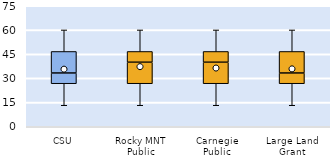
| Category | 25th | 50th | 75th |
|---|---|---|---|
| CSU | 26.667 | 6.667 | 13.333 |
| Rocky MNT Public | 26.667 | 13.333 | 6.667 |
| Carnegie Public | 26.667 | 13.333 | 6.667 |
| Large Land Grant | 26.667 | 6.667 | 13.333 |